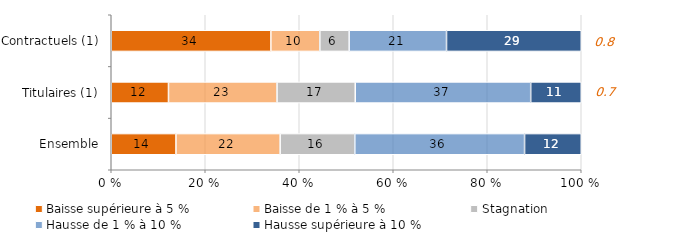
| Category | Baisse supérieure à 5 % | Baisse de 1 % à 5 % | Stagnation | Hausse de 1 % à 10 % | Hausse supérieure à 10 % |
|---|---|---|---|---|---|
| Ensemble | 13.767 | 22.172 | 15.881 | 36.12 | 12.06 |
| Titulaires (1) | 12.177 | 23.097 | 16.64 | 37.333 | 10.753 |
| Contractuels (1) | 33.961 | 10.418 | 6.236 | 20.72 | 28.665 |